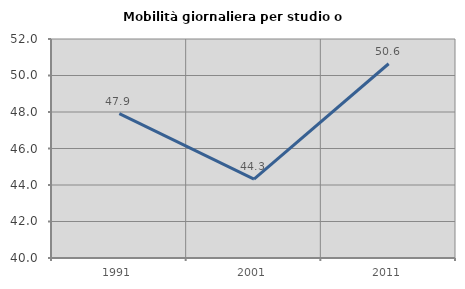
| Category | Mobilità giornaliera per studio o lavoro |
|---|---|
| 1991.0 | 47.908 |
| 2001.0 | 44.324 |
| 2011.0 | 50.644 |